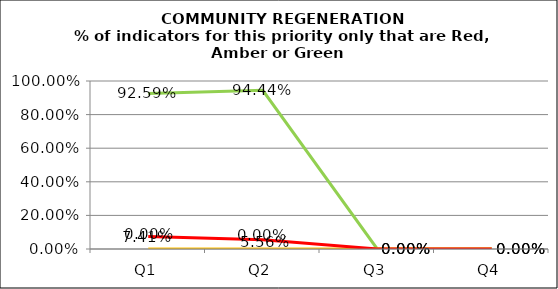
| Category | Green | Amber | Red |
|---|---|---|---|
| Q1 | 0.926 | 0 | 0.074 |
| Q2 | 0.944 | 0 | 0.056 |
| Q3 | 0 | 0 | 0 |
| Q4 | 0 | 0 | 0 |